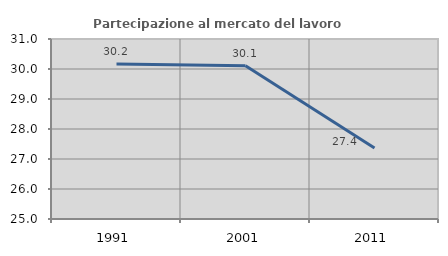
| Category | Partecipazione al mercato del lavoro  femminile |
|---|---|
| 1991.0 | 30.163 |
| 2001.0 | 30.112 |
| 2011.0 | 27.366 |